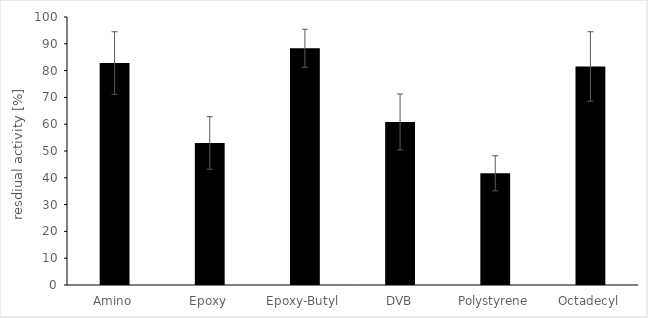
| Category | Series 0 |
|---|---|
| Amino | 82.822 |
| Epoxy | 52.995 |
| Epoxy-Butyl | 88.333 |
| DVB | 60.827 |
| Polystyrene | 41.671 |
| Octadecyl | 81.544 |